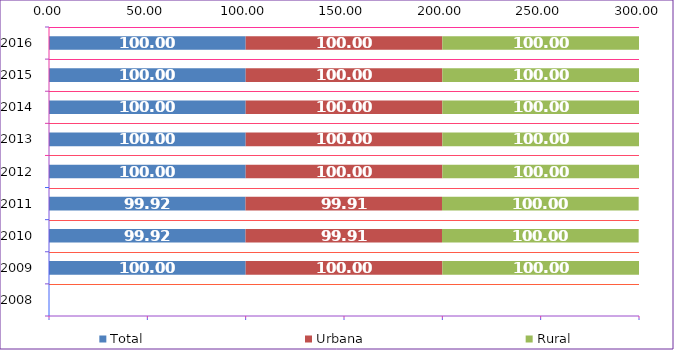
| Category | Total | Urbana | Rural |
|---|---|---|---|
| 2008.0 | 0 | 0 | 0 |
| 2009.0 | 100 | 100 | 100 |
| 2010.0 | 99.92 | 99.91 | 100 |
| 2011.0 | 99.92 | 99.91 | 100 |
| 2012.0 | 100 | 100 | 100 |
| 2013.0 | 100 | 100 | 100 |
| 2014.0 | 100 | 100 | 100 |
| 2015.0 | 100 | 100 | 100 |
| 2016.0 | 100 | 100 | 100 |